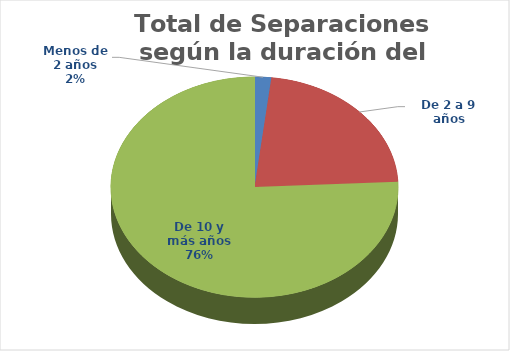
| Category | Series 0 |
|---|---|
| Menos de 2 años | 69 |
| De 2 a 9 años | 821 |
| De 10 y más años | 2784 |